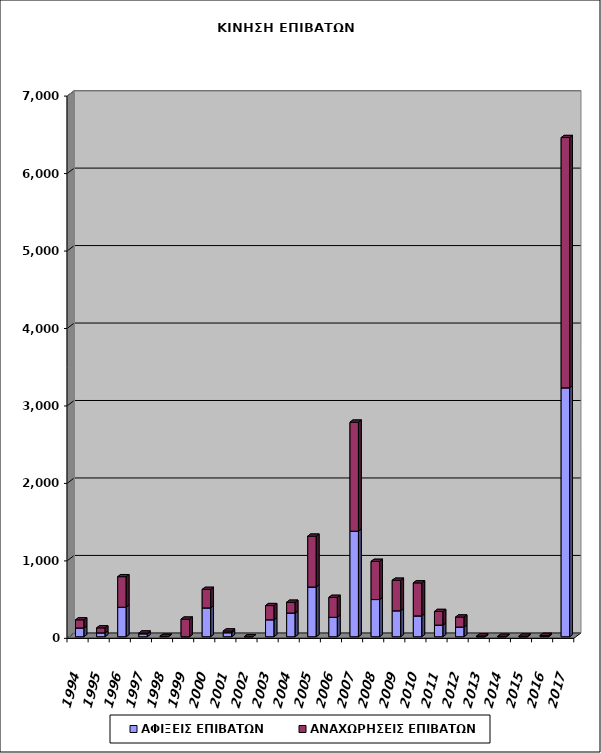
| Category | ΑΦΙΞΕΙΣ ΕΠΙΒΑΤΩΝ | ΑΝΑΧΩΡΗΣΕΙΣ ΕΠΙΒΑΤΩΝ |
|---|---|---|
| 1994.0 | 113 | 105 |
| 1995.0 | 50 | 64 |
| 1996.0 | 381 | 394 |
| 1997.0 | 38 | 10 |
| 1998.0 | 4 | 0 |
| 1999.0 | 0 | 227 |
| 2000.0 | 372 | 239 |
| 2001.0 | 52 | 22 |
| 2002.0 | 0 | 0 |
| 2003.0 | 219 | 183 |
| 2004.0 | 306 | 139 |
| 2005.0 | 642 | 656 |
| 2006.0 | 251 | 257 |
| 2007.0 | 1362 | 1408 |
| 2008.0 | 480 | 493 |
| 2009.0 | 335 | 394 |
| 2010.0 | 269 | 426 |
| 2011.0 | 150 | 176 |
| 2012.0 | 125 | 129 |
| 2013.0 | 0 | 10 |
| 2014.0 | 0 | 6 |
| 2015.0 | 0 | 8 |
| 2016.0 | 3 | 14 |
| 2017.0 | 3213 | 3231 |